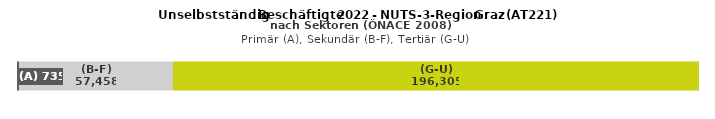
| Category | (A) | (B-F) | (G-U) |
|---|---|---|---|
| 0 | 735 | 57458 | 196305 |